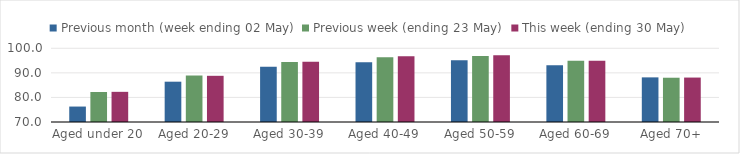
| Category | Previous month (week ending 02 May) | Previous week (ending 23 May) | This week (ending 30 May) |
|---|---|---|---|
| Aged under 20 | 76.286 | 82.22 | 82.276 |
| Aged 20-29 | 86.406 | 88.921 | 88.798 |
| Aged 30-39 | 92.499 | 94.416 | 94.547 |
| Aged 40-49 | 94.29 | 96.329 | 96.717 |
| Aged 50-59 | 95.127 | 96.84 | 97.135 |
| Aged 60-69 | 93.052 | 94.969 | 94.925 |
| Aged 70+ | 88.162 | 88.018 | 88.084 |